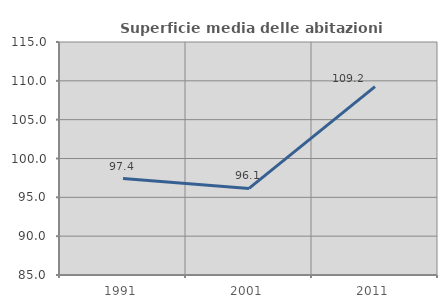
| Category | Superficie media delle abitazioni occupate |
|---|---|
| 1991.0 | 97.41 |
| 2001.0 | 96.15 |
| 2011.0 | 109.244 |